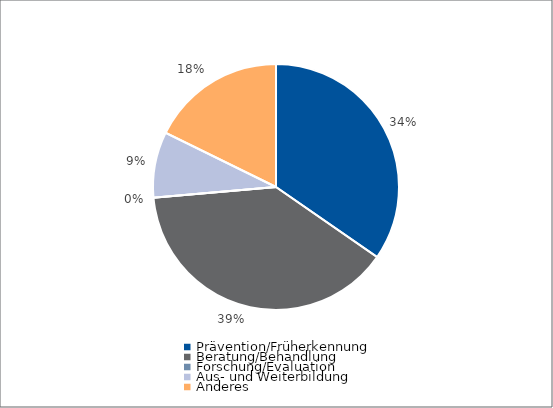
| Category | Series 0 |
|---|---|
| Prävention/Früherkennung | 35506 |
| Beratung/Behandlung | 39955.1 |
| Forschung/Evaluation | 0 |
| Aus- und Weiterbildung | 8865.35 |
| Anderes | 18179.55 |